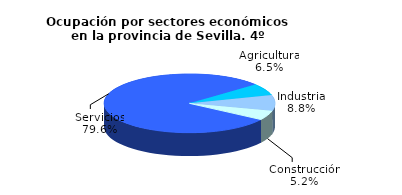
| Category | Series 0 |
|---|---|
| Agricultura | 43.4 |
| Industria | 58.9 |
| Construcción | 34.8 |
| Servicios | 535.1 |